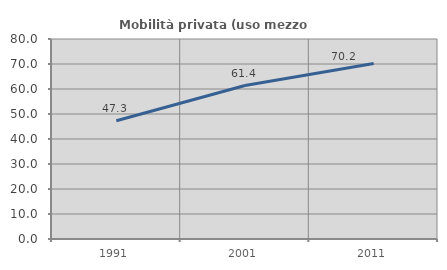
| Category | Mobilità privata (uso mezzo privato) |
|---|---|
| 1991.0 | 47.301 |
| 2001.0 | 61.4 |
| 2011.0 | 70.227 |